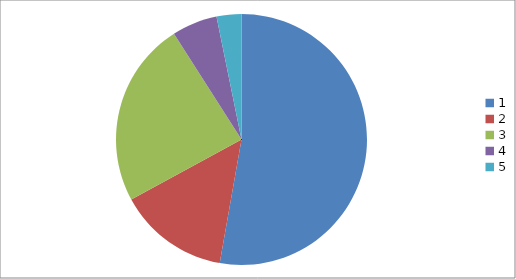
| Category | Series 0 |
|---|---|
| 0 | 52.777 |
| 1 | 14.294 |
| 2 | 23.883 |
| 3 | 5.849 |
| 4 | 3.196 |